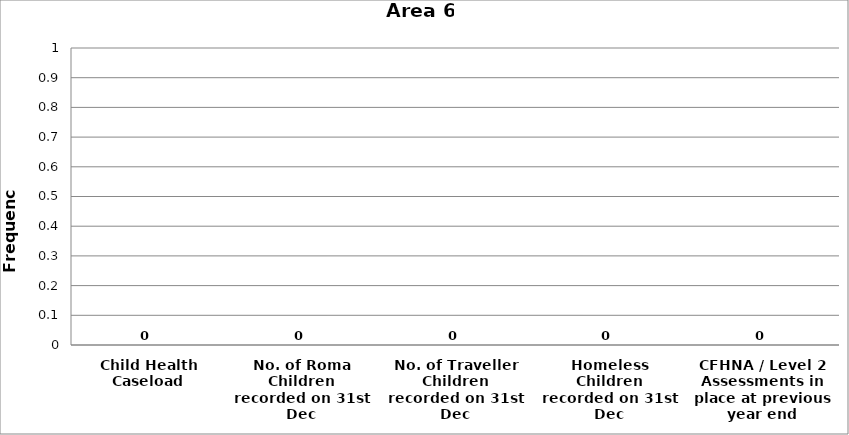
| Category | Area 6 |
|---|---|
| Child Health Caseload | 0 |
| No. of Roma Children recorded on 31st Dec | 0 |
| No. of Traveller Children recorded on 31st Dec | 0 |
| Homeless Children recorded on 31st Dec | 0 |
| CFHNA / Level 2 Assessments in place at previous year end | 0 |